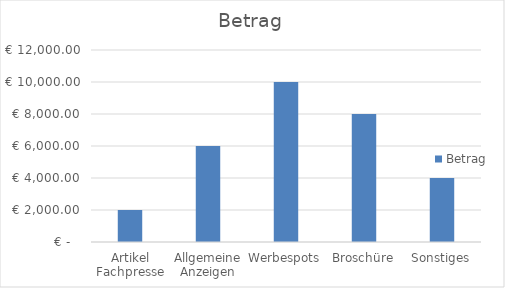
| Category | Betrag |
|---|---|
| Artikel Fachpresse | 2000 |
| Allgemeine Anzeigen | 6000 |
| Werbespots | 10000 |
| Broschüre | 8000 |
| Sonstiges | 4000 |